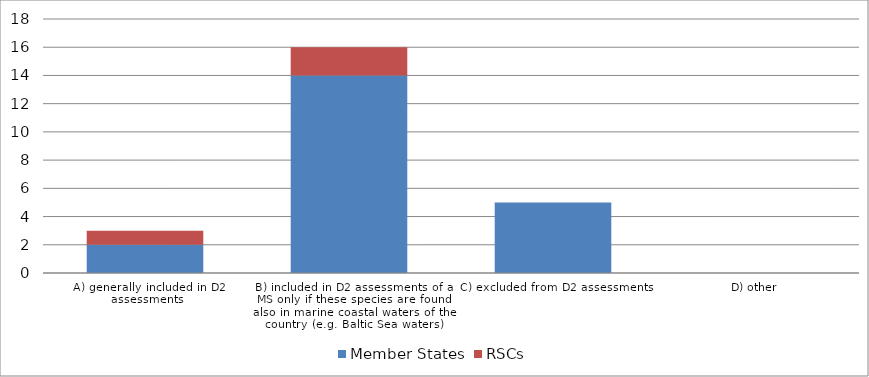
| Category | Member States | RSCs |
|---|---|---|
| A) generally included in D2 assessments | 2 | 1 |
| B) included in D2 assessments of a MS only if these species are found also in marine coastal waters of the country (e.g. Baltic Sea waters) | 14 | 2 |
| C) excluded from D2 assessments | 5 | 0 |
| D) other  | 0 | 0 |